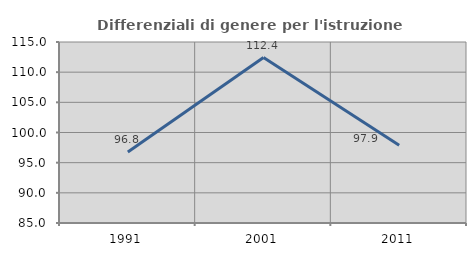
| Category | Differenziali di genere per l'istruzione superiore |
|---|---|
| 1991.0 | 96.774 |
| 2001.0 | 112.42 |
| 2011.0 | 97.881 |